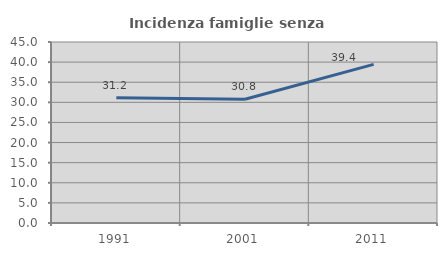
| Category | Incidenza famiglie senza nuclei |
|---|---|
| 1991.0 | 31.153 |
| 2001.0 | 30.769 |
| 2011.0 | 39.446 |